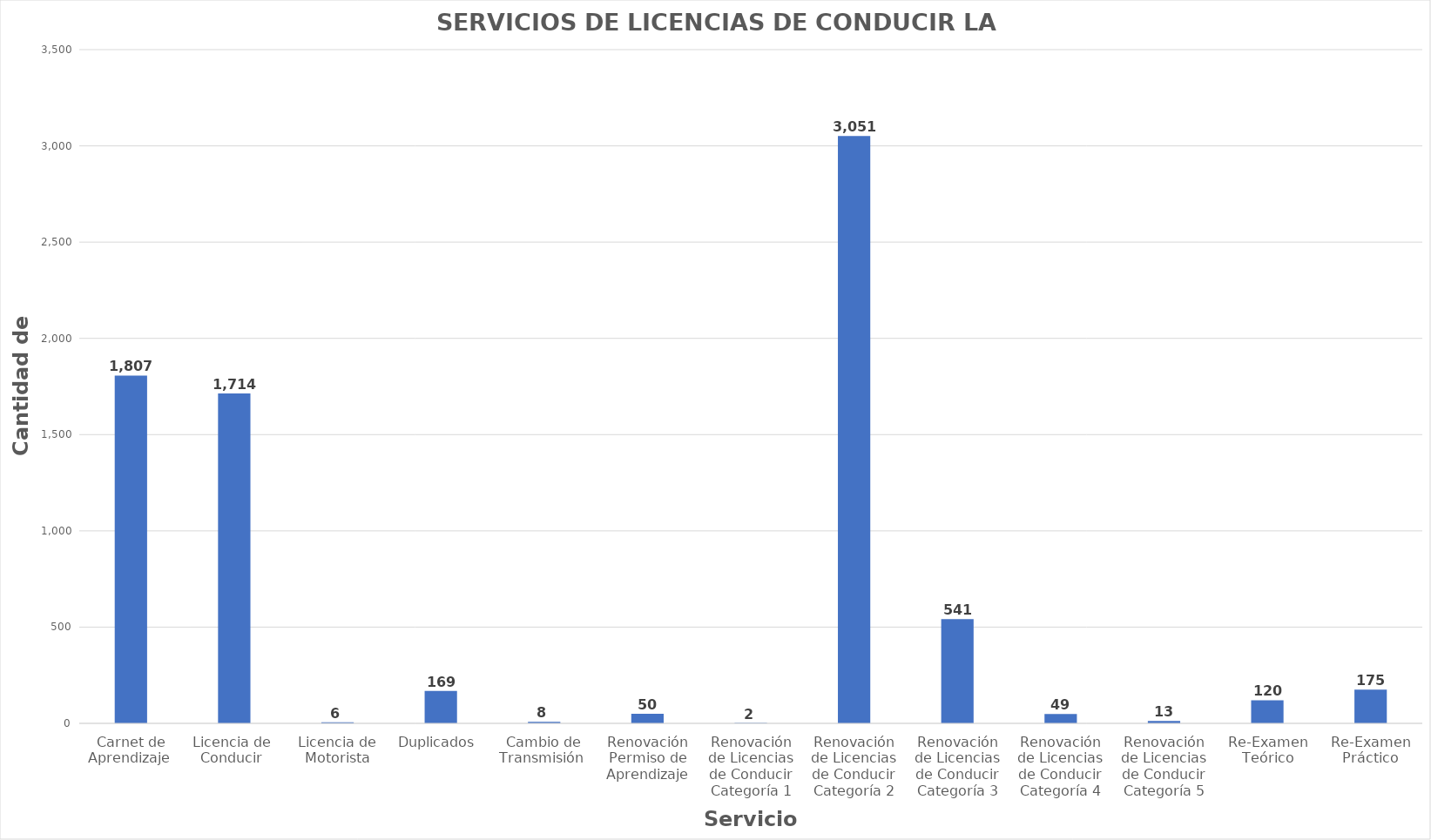
| Category | Series 0 |
|---|---|
| Carnet de Aprendizaje  | 1807 |
| Licencia de  Conducir  | 1714 |
| Licencia de Motorista | 6 |
| Duplicados  | 169 |
| Cambio de Transmisión  | 8 |
| Renovación Permiso de Aprendizaje | 50 |
| Renovación de Licencias de Conducir Categoría 1 | 2 |
| Renovación de Licencias de Conducir Categoría 2 | 3051 |
| Renovación de Licencias de Conducir Categoría 3 | 541 |
| Renovación de Licencias de Conducir Categoría 4 | 49 |
| Renovación de Licencias de Conducir Categoría 5 | 13 |
| Re-Examen Teórico | 120 |
| Re-Examen Práctico | 175 |